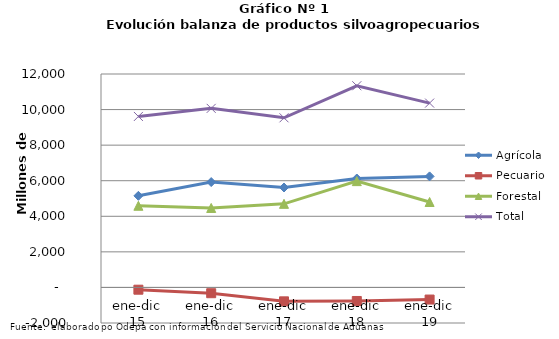
| Category | Agrícola | Pecuario | Forestal | Total |
|---|---|---|---|---|
| ene-dic 15 | 5149872 | -127785 | 4591408 | 9613495 |
| ene-dic 16 | 5924661 | -325421 | 4468104 | 10067344 |
| ene-dic 17 | 5619304 | -782654 | 4700192 | 9536842 |
| ene-dic 18 | 6124452 | -761884 | 5976134 | 11338702 |
| ene-dic 19 | 6242911 | -681921 | 4803731 | 10364721 |